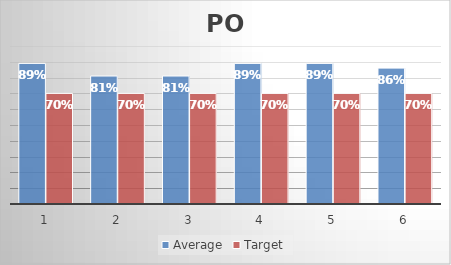
| Category | Average | Target |
|---|---|---|
| 0 | 0.89 | 0.7 |
| 1 | 0.81 | 0.7 |
| 2 | 0.81 | 0.7 |
| 3 | 0.89 | 0.7 |
| 4 | 0.89 | 0.7 |
| 5 | 0.86 | 0.7 |